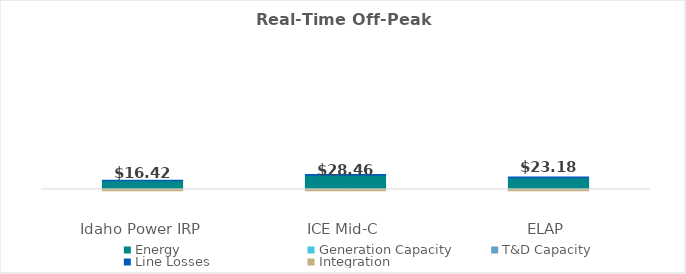
| Category | Energy | Generation Capacity | T&D Capacity | Line Losses | Integration |
|---|---|---|---|---|---|
| 0 | 18.287 | 0 | 0 | 1.061 | -2.93 |
| 1 | 29.674 | 0 | 0 | 1.721 | -2.93 |
| 2 | 24.682 | 0 | 0 | 1.432 | -2.93 |